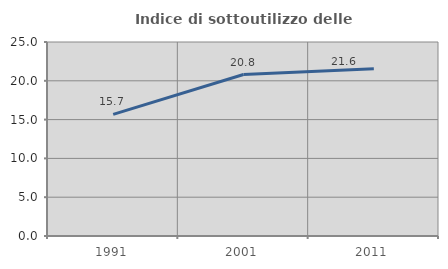
| Category | Indice di sottoutilizzo delle abitazioni  |
|---|---|
| 1991.0 | 15.678 |
| 2001.0 | 20.807 |
| 2011.0 | 21.558 |